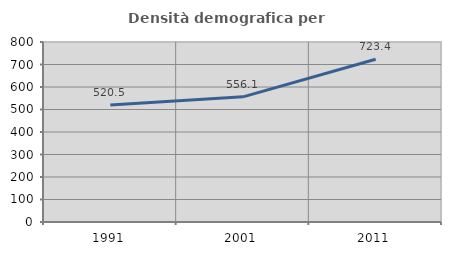
| Category | Densità demografica |
|---|---|
| 1991.0 | 520.468 |
| 2001.0 | 556.14 |
| 2011.0 | 723.392 |